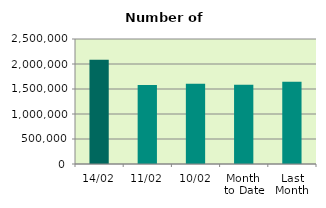
| Category | Series 0 |
|---|---|
| 14/02 | 2082970 |
| 11/02 | 1582386 |
| 10/02 | 1604630 |
| Month 
to Date | 1586677 |
| Last
Month | 1644892 |